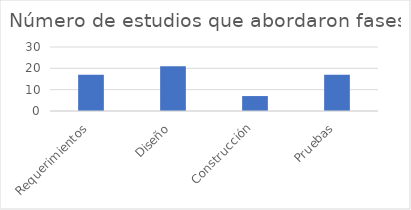
| Category | Número de estudios que abordaron fases |
|---|---|
| Requerimientos | 17 |
| Diseño | 21 |
| Construcción | 7 |
| Pruebas | 17 |